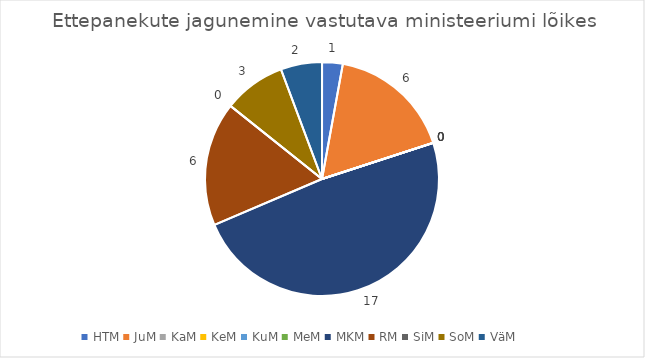
| Category | Ettepanekute jagunemine vastutava ministeeriumi lõikes |
|---|---|
| HTM | 1 |
| JuM | 6 |
| KaM | 0 |
| KeM | 0 |
| KuM | 0 |
| MeM | 0 |
| MKM | 17 |
| RM | 6 |
| SiM | 0 |
| SoM | 3 |
| VäM | 2 |